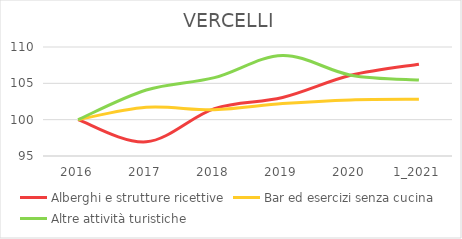
| Category | Alberghi e strutture ricettive | Bar ed esercizi senza cucina | Altre attività turistiche |
|---|---|---|---|
| 2016 | 100 | 100 | 100 |
| 2017 | 96.947 | 101.702 | 104.082 |
| 2018 | 101.527 | 101.362 | 105.782 |
| 2019 | 103.053 | 102.213 | 108.844 |
| 2020 | 106.107 | 102.723 | 106.122 |
| 1_2021 | 107.634 | 102.809 | 105.442 |